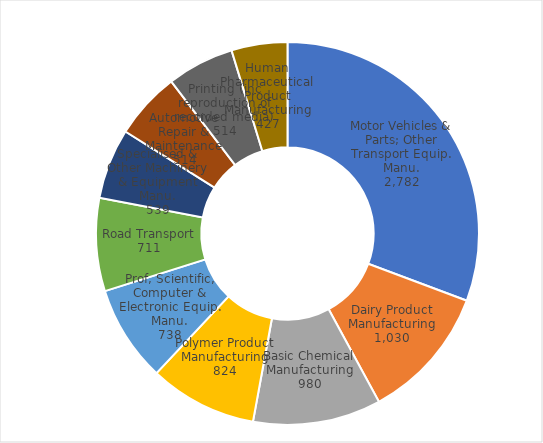
| Category | Series 0 |
|---|---|
| Motor Vehicles & Parts; Other Transport Equip. Manu. | 2782.076 |
| Dairy Product Manufacturing | 1030.362 |
| Basic Chemical Manufacturing | 979.709 |
| Polymer Product Manufacturing | 824.379 |
| Prof, Scientific, Computer & Electronic Equip. Manu. | 738.366 |
| Road Transport | 711.173 |
| Specialised & Other Machinery & Equipment Manu. | 539.122 |
| Automotive Repair & Maintenance | 514.211 |
| Printing (inc reproduction of recorded media) | 513.699 |
| Human Pharmaceutical Product Manufacturing | 427.389 |